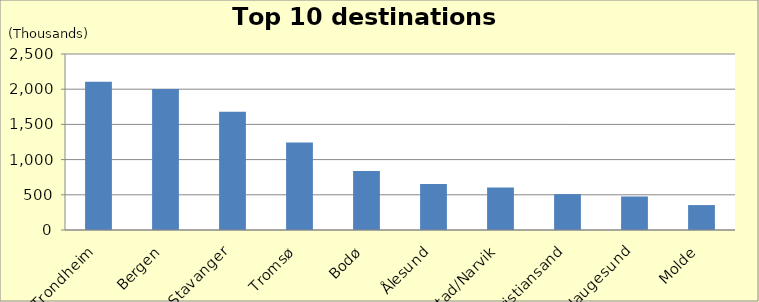
| Category | Number of passengers  |
|---|---|
| Trondheim | 2106.412 |
| Bergen | 2001.863 |
| Stavanger | 1681.219 |
| Tromsø | 1242.944 |
| Bodø | 837.632 |
| Ålesund | 654.858 |
| Harstad/Narvik | 604.695 |
| Kristiansand | 510.041 |
| Haugesund | 476.008 |
| Molde | 353.908 |